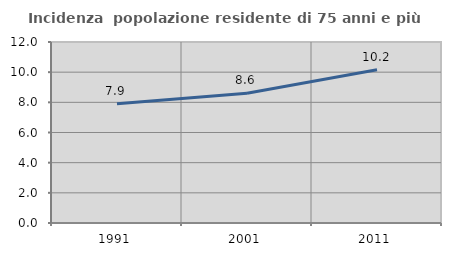
| Category | Incidenza  popolazione residente di 75 anni e più |
|---|---|
| 1991.0 | 7.905 |
| 2001.0 | 8.601 |
| 2011.0 | 10.161 |